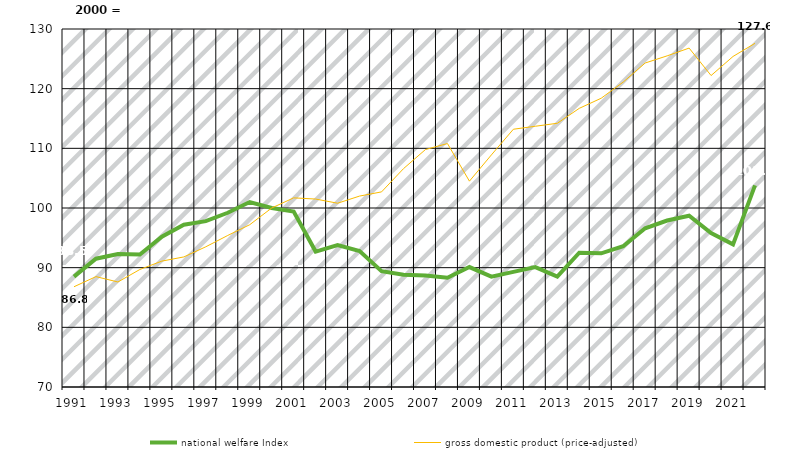
| Category | national welfare Index | gross domestic product (price-adjusted) |
|---|---|---|
| 1991.0 | 88.5 | 86.8 |
| 1992.0 | 91.5 | 88.5 |
| 1993.0 | 92.3 | 87.6 |
| 1994.0 | 92.2 | 89.7 |
| 1995.0 | 95.2 | 91.1 |
| 1996.0 | 97.2 | 91.8 |
| 1997.0 | 97.8 | 93.5 |
| 1998.0 | 99.2 | 95.4 |
| 1999.0 | 101 | 97.2 |
| 2000.0 | 100 | 100 |
| 2001.0 | 99.4 | 101.7 |
| 2002.0 | 92.7 | 101.5 |
| 2003.0 | 93.8 | 100.8 |
| 2004.0 | 92.8 | 102 |
| 2005.0 | 89.4 | 102.7 |
| 2006.0 | 88.8 | 106.6 |
| 2007.0 | 88.7 | 109.8 |
| 2008.0 | 88.3 | 110.8 |
| 2009.0 | 90.1 | 104.5 |
| 2010.0 | 88.5 | 108.9 |
| 2011.0 | 89.3 | 113.2 |
| 2012.0 | 90.1 | 113.7 |
| 2013.0 | 88.5 | 114.2 |
| 2014.0 | 92.5 | 116.7 |
| 2015.0 | 92.4 | 118.4 |
| 2016.0 | 93.6 | 121.1 |
| 2017.0 | 96.6 | 124.3 |
| 2018.0 | 97.9 | 125.5 |
| 2019.0 | 98.7 | 126.8 |
| 2020.0 | 95.8 | 122.2 |
| 2021.0 | 93.9 | 125.4 |